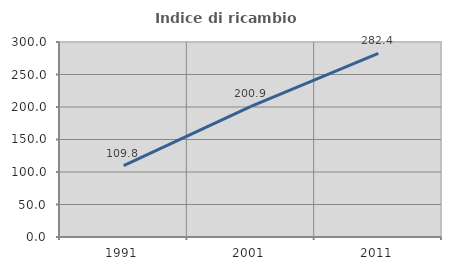
| Category | Indice di ricambio occupazionale  |
|---|---|
| 1991.0 | 109.816 |
| 2001.0 | 200.877 |
| 2011.0 | 282.353 |